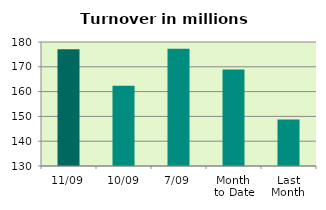
| Category | Series 0 |
|---|---|
| 11/09 | 177.033 |
| 10/09 | 162.409 |
| 7/09 | 177.306 |
| Month 
to Date | 168.862 |
| Last
Month | 148.736 |